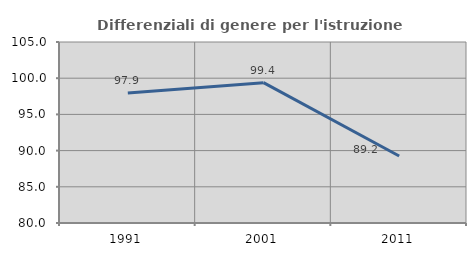
| Category | Differenziali di genere per l'istruzione superiore |
|---|---|
| 1991.0 | 97.941 |
| 2001.0 | 99.387 |
| 2011.0 | 89.25 |